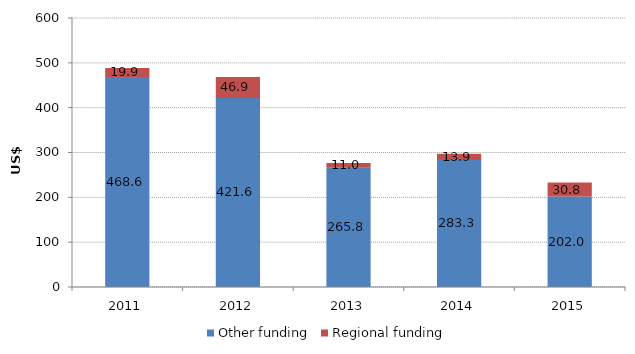
| Category | Other funding | Regional funding |
|---|---|---|
| 2011.0 | 468.562 | 19.916 |
| 2012.0 | 421.57 | 46.875 |
| 2013.0 | 265.773 | 11.036 |
| 2014.0 | 283.292 | 13.891 |
| 2015.0 | 202.02 | 30.847 |